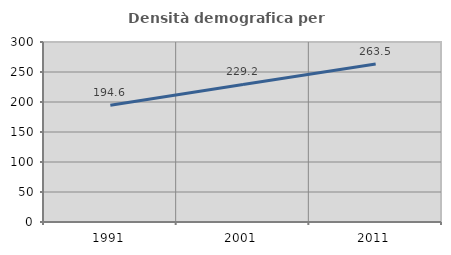
| Category | Densità demografica |
|---|---|
| 1991.0 | 194.561 |
| 2001.0 | 229.176 |
| 2011.0 | 263.473 |